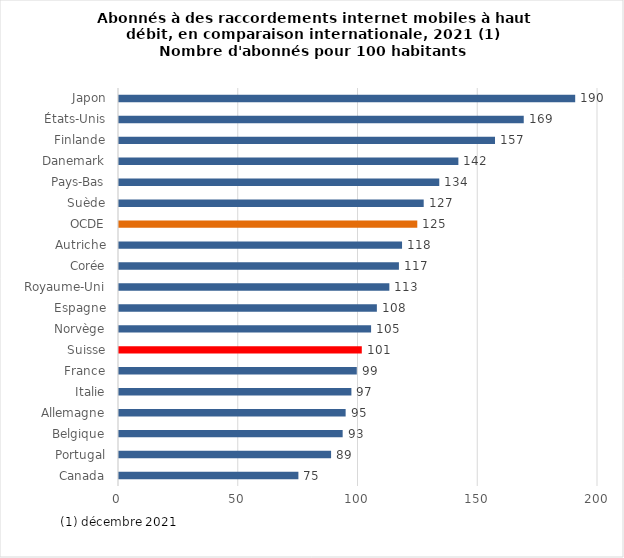
| Category | Series 0 |
|---|---|
| Canada | 74.904 |
| Portugal | 88.552 |
| Belgique | 93.385 |
| Allemagne | 94.63 |
| Italie | 97.038 |
| France | 99.283 |
| Suisse | 101.374 |
| Norvège | 105.255 |
| Espagne | 107.669 |
| Royaume-Uni | 112.882 |
| Corée | 116.879 |
| Autriche | 118.181 |
| OCDE | 124.545 |
| Suède | 127.224 |
| Pays-Bas | 133.722 |
| Danemark | 141.701 |
| Finlande | 156.997 |
| États-Unis | 168.995 |
| Japon | 190.477 |